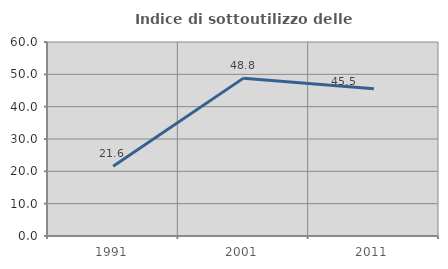
| Category | Indice di sottoutilizzo delle abitazioni  |
|---|---|
| 1991.0 | 21.569 |
| 2001.0 | 48.825 |
| 2011.0 | 45.531 |